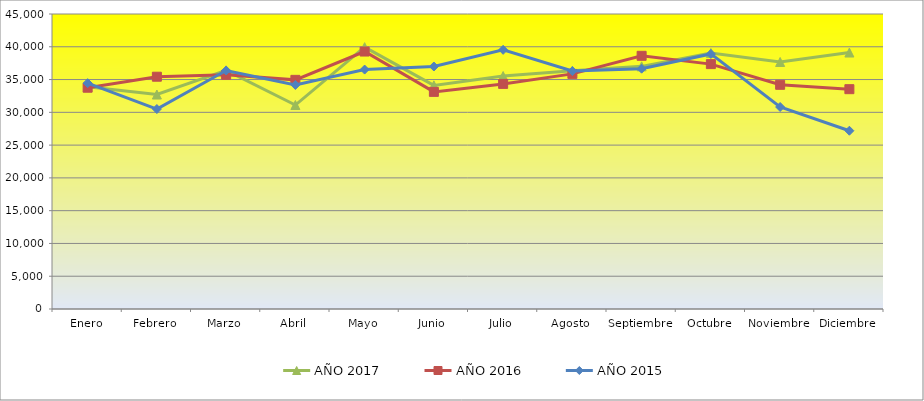
| Category | AÑO 2017 | AÑO 2016 | AÑO 2015 |
|---|---|---|---|
| Enero | 33891.429 | 33754 | 34452 |
| Febrero | 32717.143 | 35434 | 30500 |
| Marzo | 36411.429 | 35726 | 36379 |
| Abril | 31114.286 | 34954 | 34172 |
| Mayo | 39942.857 | 39274 | 36524 |
| Junio | 34114.286 | 33120 | 36987 |
| Julio | 35537.143 | 34337 | 39530 |
| Agosto | 36325.714 | 35863 | 36300 |
| Septiembre | 37011.429 | 38623 | 36659 |
| Octubre | 39046.341 | 37354 | 38911 |
| Noviembre | 37680.488 | 34200 | 30814 |
| Diciembre | 39120 | 33531 | 27195 |